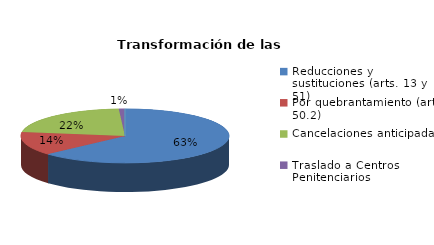
| Category | Series 0 |
|---|---|
| Reducciones y sustituciones (arts. 13 y 51) | 67 |
| Por quebrantamiento (art. 50.2) | 15 |
| Cancelaciones anticipadas | 23 |
| Traslado a Centros Penitenciarios | 1 |
| Conversión internamientos en cerrados (art. 51.2) | 0 |